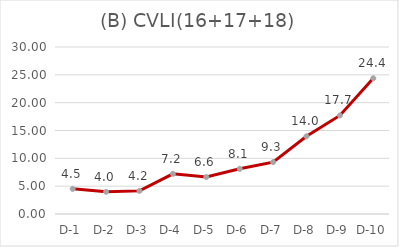
| Category | CVLI(16+17+18) |
|---|---|
| D-1 | 4.516 |
| D-2 | 3.985 |
| D-3 | 4.154 |
| D-4 | 7.22 |
| D-5 | 6.641 |
| D-6 | 8.114 |
| D-7 | 9.321 |
| D-8 | 13.958 |
| D-9 | 17.701 |
| D-10 | 24.39 |